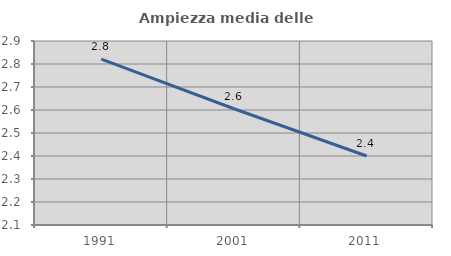
| Category | Ampiezza media delle famiglie |
|---|---|
| 1991.0 | 2.821 |
| 2001.0 | 2.605 |
| 2011.0 | 2.4 |